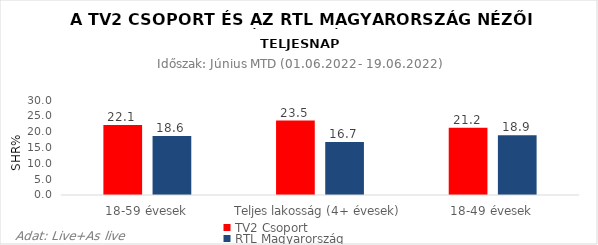
| Category | TV2 Csoport | RTL Magyarország |
|---|---|---|
| 18-59 évesek | 22.1 | 18.6 |
| Teljes lakosság (4+ évesek) | 23.5 | 16.7 |
| 18-49 évesek | 21.2 | 18.9 |